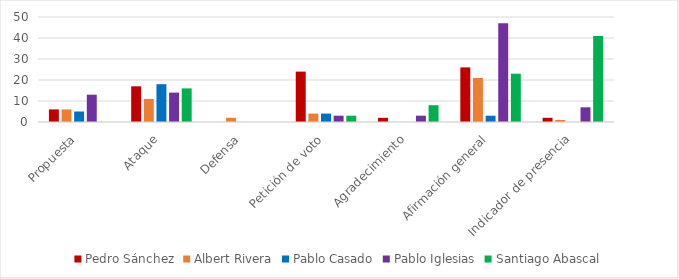
| Category | Pedro Sánchez | Albert Rivera | Pablo Casado | Pablo Iglesias | Santiago Abascal |
|---|---|---|---|---|---|
| Propuesta | 6 | 6 | 5 | 13 | 0 |
| Ataque | 17 | 11 | 18 | 14 | 16 |
| Defensa | 0 | 2 | 0 | 0 | 0 |
| Petición de voto | 24 | 4 | 4 | 3 | 3 |
| Agradecimiento | 2 | 0 | 0 | 3 | 8 |
| Afirmación general | 26 | 21 | 3 | 47 | 23 |
| Indicador de presencia | 2 | 1 | 0 | 7 | 41 |